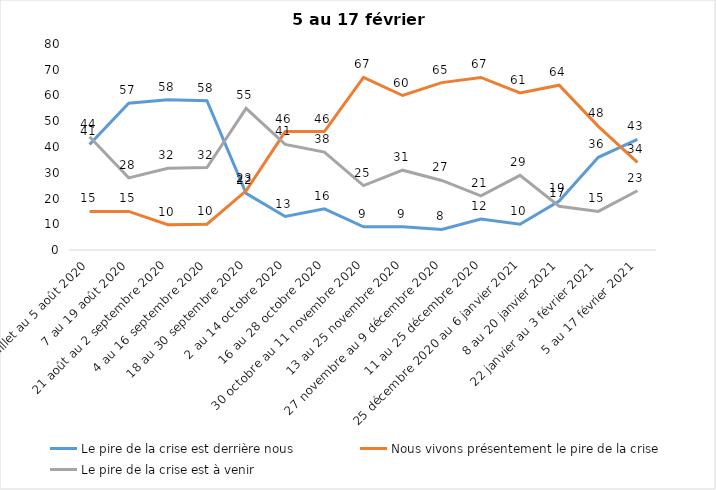
| Category | Le pire de la crise est derrière nous | Nous vivons présentement le pire de la crise | Le pire de la crise est à venir |
|---|---|---|---|
| 24 juillet au 5 août 2020 | 41 | 15 | 44 |
| 7 au 19 août 2020 | 57 | 15 | 28 |
| 21 août au 2 septembre 2020 | 58.39 | 9.84 | 31.77 |
| 4 au 16 septembre 2020 | 58 | 10 | 32 |
| 18 au 30 septembre 2020 | 22 | 23 | 55 |
| 2 au 14 octobre 2020 | 13 | 46 | 41 |
| 16 au 28 octobre 2020 | 16 | 46 | 38 |
| 30 octobre au 11 novembre 2020 | 9 | 67 | 25 |
| 13 au 25 novembre 2020 | 9 | 60 | 31 |
| 27 novembre au 9 décembre 2020 | 8 | 65 | 27 |
| 11 au 25 décembre 2020 | 12 | 67 | 21 |
| 25 décembre 2020 au 6 janvier 2021 | 10 | 61 | 29 |
| 8 au 20 janvier 2021 | 19 | 64 | 17 |
| 22 janvier au 3 février 2021 | 36 | 48 | 15 |
| 5 au 17 février 2021 | 43 | 34 | 23 |